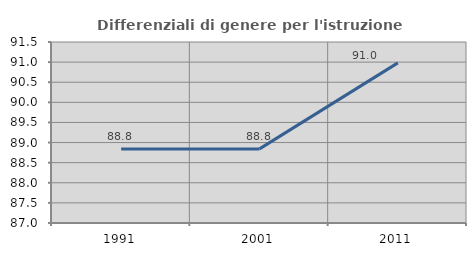
| Category | Differenziali di genere per l'istruzione superiore |
|---|---|
| 1991.0 | 88.839 |
| 2001.0 | 88.843 |
| 2011.0 | 90.981 |